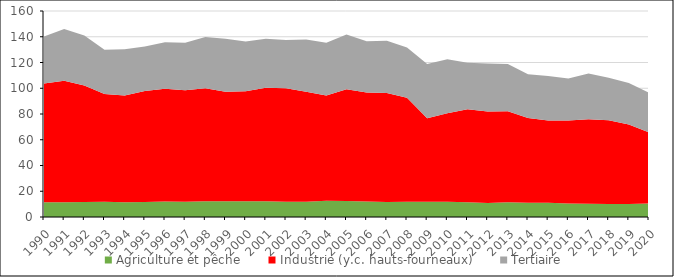
| Category | Agriculture et pêche | Industrie (y.c. hauts-fourneaux) | Tertiaire |
|---|---|---|---|
| 1990.0 | 11.409 | 92.374 | 36.427 |
| 1991.0 | 11.486 | 94.417 | 40.036 |
| 1992.0 | 11.615 | 90.583 | 38.833 |
| 1993.0 | 11.803 | 83.78 | 34.366 |
| 1994.0 | 11.537 | 82.746 | 36.008 |
| 1995.0 | 11.623 | 86.144 | 34.753 |
| 1996.0 | 11.955 | 87.662 | 36.165 |
| 1997.0 | 11.856 | 86.684 | 36.863 |
| 1998.0 | 12.21 | 87.751 | 39.829 |
| 1999.0 | 12.153 | 85.203 | 41.079 |
| 2000.0 | 12.174 | 85.501 | 38.69 |
| 2001.0 | 12.306 | 88.103 | 38.045 |
| 2002.0 | 11.88 | 88.07 | 37.598 |
| 2003.0 | 11.757 | 85.549 | 40.65 |
| 2004.0 | 12.63 | 81.744 | 40.881 |
| 2005.0 | 12.418 | 86.82 | 42.559 |
| 2006.0 | 12.004 | 84.665 | 39.762 |
| 2007.0 | 11.711 | 84.615 | 40.584 |
| 2008.0 | 11.838 | 80.758 | 39.083 |
| 2009.0 | 11.846 | 64.913 | 42.141 |
| 2010.0 | 11.783 | 68.839 | 41.917 |
| 2011.0 | 11.382 | 72.279 | 36.149 |
| 2012.0 | 10.955 | 71.014 | 37.217 |
| 2013.0 | 11.449 | 70.752 | 36.689 |
| 2014.0 | 11.157 | 65.709 | 34.034 |
| 2015.0 | 11.086 | 63.951 | 34.51 |
| 2016.0 | 10.464 | 64.423 | 32.746 |
| 2017.0 | 10.296 | 65.67 | 35.565 |
| 2018.0 | 10.171 | 65.068 | 32.851 |
| 2019.0 | 10.092 | 61.796 | 32.236 |
| 2020.0 | 10.537 | 55.234 | 30.735 |